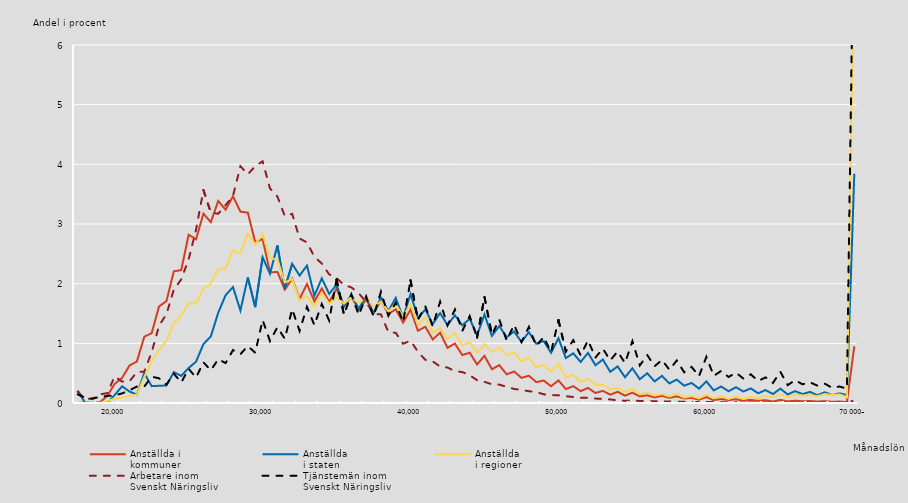
| Category | Anställda i 
kommuner | Anställda 
i staten | Anställda 
i regioner | Arbetare inom 
Svenskt Näringsliv | Tjänstemän inom
Svenskt Näringsliv |
|---|---|---|---|---|---|
|  | 0.001 | 0.21 | 0.002 | 0.187 | 0.143 |
|  | 0.007 | 0 | 0 | 0.068 | 0.089 |
|  | 0.005 | 0.002 | 0.001 | 0.072 | 0.072 |
|  | 0.011 | 0.005 | 0 | 0.145 | 0.105 |
|  | 0.119 | 0.003 | 0.036 | 0.165 | 0.117 |
| 20 000 | 0.321 | 0.134 | 0.074 | 0.445 | 0.128 |
|  | 0.42 | 0.28 | 0.091 | 0.358 | 0.161 |
|  | 0.628 | 0.192 | 0.115 | 0.364 | 0.214 |
|  | 0.695 | 0.14 | 0.141 | 0.518 | 0.275 |
|  | 1.11 | 0.501 | 0.436 | 0.526 | 0.276 |
|  | 1.171 | 0.283 | 0.697 | 0.851 | 0.44 |
|  | 1.619 | 0.288 | 0.892 | 1.296 | 0.414 |
|  | 1.708 | 0.293 | 1.041 | 1.489 | 0.309 |
|  | 2.207 | 0.518 | 1.332 | 1.902 | 0.49 |
|  | 2.227 | 0.454 | 1.466 | 2.072 | 0.344 |
|  | 2.82 | 0.587 | 1.671 | 2.408 | 0.573 |
|  | 2.745 | 0.693 | 1.668 | 2.903 | 0.426 |
|  | 3.173 | 0.988 | 1.921 | 3.568 | 0.682 |
|  | 3.031 | 1.116 | 2 | 3.192 | 0.548 |
|  | 3.386 | 1.513 | 2.245 | 3.172 | 0.734 |
|  | 3.239 | 1.808 | 2.257 | 3.315 | 0.669 |
|  | 3.464 | 1.942 | 2.56 | 3.472 | 0.887 |
|  | 3.207 | 1.549 | 2.511 | 3.969 | 0.819 |
|  | 3.19 | 2.104 | 2.841 | 3.832 | 0.955 |
|  | 2.695 | 1.607 | 2.66 | 3.969 | 0.843 |
| 30 000 | 2.748 | 2.442 | 2.83 | 4.051 | 1.389 |
|  | 2.188 | 2.165 | 2.426 | 3.596 | 1.038 |
|  | 2.197 | 2.642 | 2.407 | 3.46 | 1.27 |
|  | 1.9 | 1.919 | 2.019 | 3.134 | 1.076 |
|  | 2.084 | 2.332 | 2.075 | 3.17 | 1.572 |
|  | 1.746 | 2.136 | 1.723 | 2.758 | 1.208 |
|  | 1.993 | 2.303 | 1.787 | 2.69 | 1.61 |
|  | 1.703 | 1.797 | 1.62 | 2.451 | 1.306 |
|  | 1.919 | 2.089 | 1.849 | 2.338 | 1.659 |
|  | 1.695 | 1.829 | 1.661 | 2.155 | 1.383 |
|  | 1.916 | 1.98 | 1.77 | 2.093 | 2.072 |
|  | 1.614 | 1.62 | 1.666 | 1.978 | 1.48 |
|  | 1.788 | 1.816 | 1.773 | 1.938 | 1.82 |
|  | 1.561 | 1.58 | 1.67 | 1.84 | 1.475 |
|  | 1.74 | 1.792 | 1.779 | 1.692 | 1.781 |
|  | 1.506 | 1.5 | 1.608 | 1.49 | 1.451 |
|  | 1.715 | 1.769 | 1.7 | 1.485 | 1.864 |
|  | 1.493 | 1.54 | 1.533 | 1.189 | 1.462 |
|  | 1.571 | 1.761 | 1.659 | 1.176 | 1.681 |
|  | 1.348 | 1.427 | 1.441 | 0.993 | 1.358 |
| 40 000 | 1.566 | 1.827 | 1.654 | 1.045 | 2.057 |
|  | 1.211 | 1.43 | 1.305 | 0.859 | 1.391 |
|  | 1.279 | 1.566 | 1.441 | 0.724 | 1.619 |
|  | 1.064 | 1.323 | 1.176 | 0.698 | 1.287 |
|  | 1.179 | 1.507 | 1.257 | 0.611 | 1.698 |
|  | 0.924 | 1.306 | 1.076 | 0.594 | 1.301 |
|  | 0.996 | 1.471 | 1.172 | 0.534 | 1.567 |
|  | 0.804 | 1.302 | 0.963 | 0.518 | 1.209 |
|  | 0.843 | 1.412 | 1.022 | 0.467 | 1.456 |
|  | 0.646 | 1.134 | 0.841 | 0.382 | 1.097 |
|  | 0.79 | 1.484 | 0.988 | 0.355 | 1.777 |
|  | 0.566 | 1.125 | 0.855 | 0.313 | 1.143 |
|  | 0.634 | 1.29 | 0.934 | 0.308 | 1.398 |
|  | 0.481 | 1.103 | 0.797 | 0.271 | 1.049 |
|  | 0.528 | 1.199 | 0.856 | 0.235 | 1.311 |
|  | 0.421 | 1.024 | 0.701 | 0.22 | 1.022 |
|  | 0.457 | 1.188 | 0.759 | 0.198 | 1.275 |
|  | 0.35 | 0.994 | 0.6 | 0.185 | 0.955 |
|  | 0.377 | 1.038 | 0.629 | 0.145 | 1.109 |
|  | 0.28 | 0.842 | 0.53 | 0.133 | 0.854 |
| 50 000 | 0.379 | 1.086 | 0.661 | 0.129 | 1.391 |
|  | 0.233 | 0.753 | 0.425 | 0.114 | 0.863 |
|  | 0.283 | 0.833 | 0.471 | 0.101 | 1.052 |
|  | 0.199 | 0.688 | 0.354 | 0.088 | 0.8 |
|  | 0.253 | 0.84 | 0.405 | 0.088 | 1.05 |
|  | 0.167 | 0.633 | 0.308 | 0.074 | 0.762 |
|  | 0.203 | 0.728 | 0.307 | 0.069 | 0.911 |
|  | 0.139 | 0.523 | 0.229 | 0.06 | 0.714 |
|  | 0.188 | 0.613 | 0.248 | 0.044 | 0.863 |
|  | 0.123 | 0.432 | 0.187 | 0.038 | 0.67 |
|  | 0.173 | 0.582 | 0.237 | 0.042 | 1.036 |
|  | 0.111 | 0.398 | 0.146 | 0.034 | 0.63 |
|  | 0.129 | 0.499 | 0.173 | 0.032 | 0.804 |
|  | 0.094 | 0.362 | 0.124 | 0.03 | 0.616 |
|  | 0.12 | 0.454 | 0.151 | 0.028 | 0.723 |
|  | 0.087 | 0.329 | 0.108 | 0.026 | 0.556 |
|  | 0.111 | 0.392 | 0.155 | 0.024 | 0.713 |
|  | 0.076 | 0.29 | 0.09 | 0.02 | 0.515 |
|  | 0.087 | 0.336 | 0.115 | 0.019 | 0.605 |
|  | 0.055 | 0.241 | 0.077 | 0.015 | 0.449 |
| 60 000 | 0.099 | 0.362 | 0.136 | 0.018 | 0.773 |
|  | 0.047 | 0.211 | 0.077 | 0.017 | 0.454 |
|  | 0.066 | 0.277 | 0.115 | 0.013 | 0.538 |
|  | 0.05 | 0.197 | 0.067 | 0.012 | 0.436 |
|  | 0.062 | 0.264 | 0.11 | 0.011 | 0.509 |
|  | 0.037 | 0.192 | 0.068 | 0.01 | 0.409 |
|  | 0.053 | 0.245 | 0.102 | 0.009 | 0.48 |
|  | 0.036 | 0.163 | 0.078 | 0.01 | 0.368 |
|  | 0.047 | 0.217 | 0.114 | 0.007 | 0.429 |
|  | 0.025 | 0.15 | 0.097 | 0.005 | 0.336 |
|  | 0.053 | 0.24 | 0.148 | 0.005 | 0.524 |
|  | 0.026 | 0.143 | 0.094 | 0.004 | 0.3 |
|  | 0.039 | 0.199 | 0.142 | 0.004 | 0.383 |
|  | 0.028 | 0.149 | 0.125 | 0.004 | 0.313 |
|  | 0.034 | 0.186 | 0.136 | 0.004 | 0.347 |
|  | 0.025 | 0.13 | 0.113 | 0.003 | 0.292 |
|  | 0.031 | 0.18 | 0.15 | 0.004 | 0.324 |
|  | 0.02 | 0.132 | 0.131 | 0.002 | 0.255 |
|  | 0.024 | 0.162 | 0.145 | 0.003 | 0.277 |
|  | 0.016 | 0.133 | 0.099 | 0.002 | 0.239 |
| 70 000– | 0.951 | 3.842 | 7.568 | 0.043 | 9.047 |